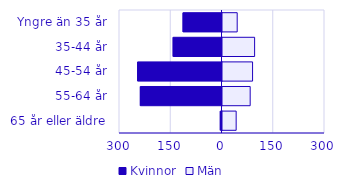
| Category | Kvinnor | Män |
|---|---|---|
| 0 | -114 | 43 |
| 1 | -143 | 94 |
| 2 | -247 | 88 |
| 3 | -239 | 81 |
| 4 | -5 | 40 |